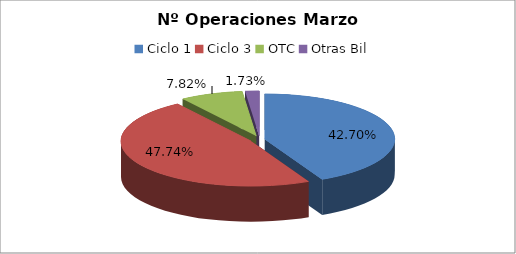
| Category | Series 0 |
|---|---|
| Ciclo 1 | 45373 |
| Ciclo 3 | 50721 |
| OTC | 8313 |
| Otras Bil | 1843 |